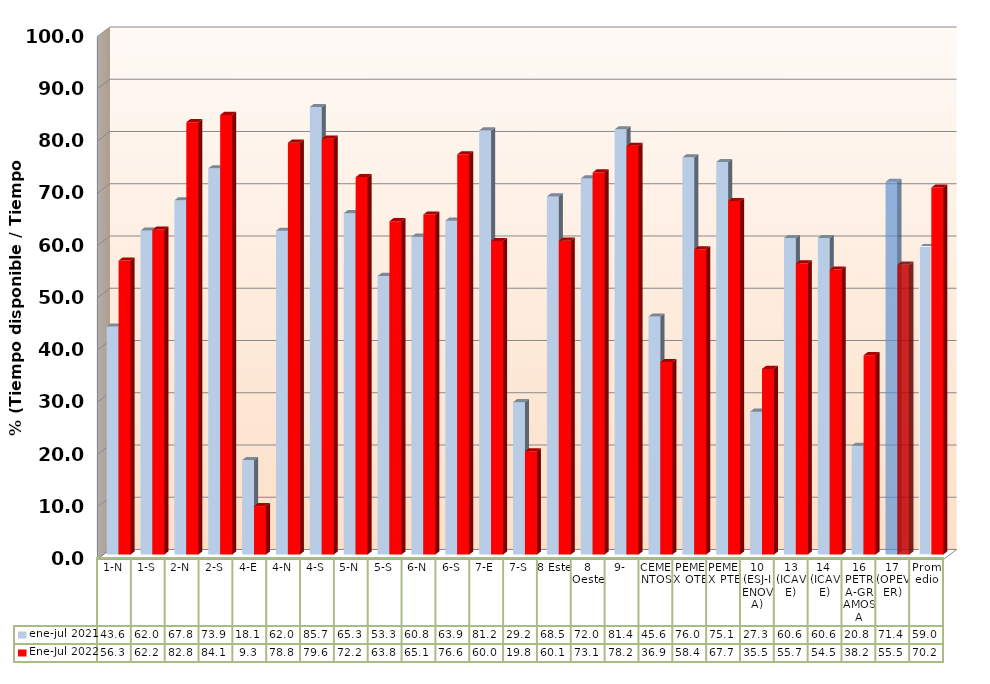
| Category | ene-jul 2021 | Ene-Jul 2022 |
|---|---|---|
| 1-N | 43.646 | 56.257 |
| 1-S | 61.997 | 62.187 |
| 2-N | 67.803 | 82.759 |
| 2-S | 73.912 | 84.142 |
| 4-E | 18.085 | 9.273 |
| 4-N | 61.975 | 78.831 |
| 4-S | 85.653 | 79.586 |
| 5-N | 65.339 | 72.236 |
| 5-S | 53.319 | 63.805 |
| 6-N | 60.831 | 65.088 |
| 6-S | 63.908 | 76.597 |
| 7-E | 81.176 | 60.008 |
| 7-S | 29.17 | 19.771 |
| 8 Este | 68.539 | 60.08 |
| 8 Oeste | 71.982 | 73.136 |
| 9- | 81.381 | 78.217 |
| CEMENTOS | 45.56 | 36.852 |
| PEMEX OTE | 76.021 | 58.428 |
| PEMEX PTE | 75.115 | 67.665 |
| 10 (ESJ-IENOVA) | 27.346 | 35.529 |
| 13 (ICAVE) | 60.588 | 55.724 |
| 14  (ICAVE) | 60.588 | 54.548 |
| 16 PETRA-GRAMOSA | 20.828 | 38.156 |
| 17 (OPEVER) | 71.352 | 55.486 |
| Promedio | 58.962 | 70.244 |